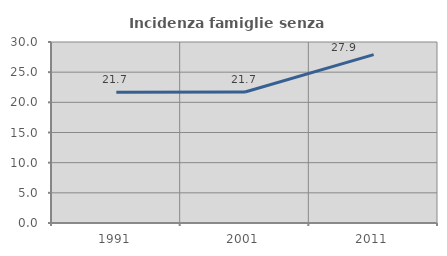
| Category | Incidenza famiglie senza nuclei |
|---|---|
| 1991.0 | 21.666 |
| 2001.0 | 21.702 |
| 2011.0 | 27.903 |